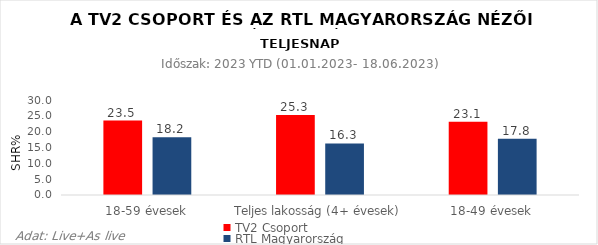
| Category | TV2 Csoport | RTL Magyarország |
|---|---|---|
| 18-59 évesek | 23.5 | 18.2 |
| Teljes lakosság (4+ évesek) | 25.3 | 16.3 |
| 18-49 évesek | 23.1 | 17.8 |